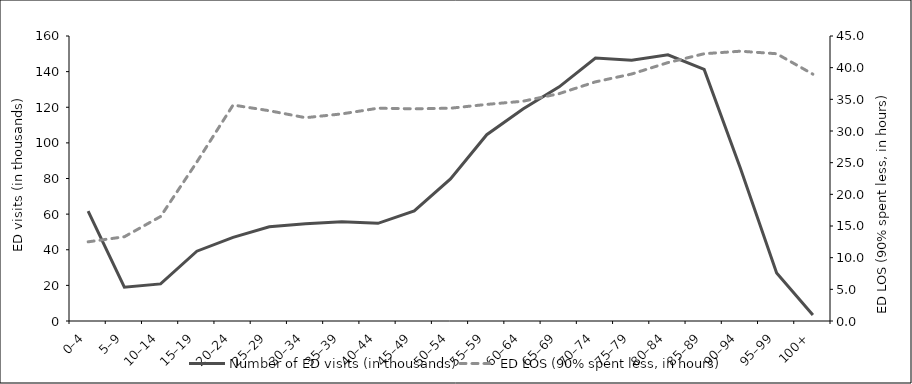
| Category | Number of ED visits (in thousands) |
|---|---|
| 0–4 | 61.654 |
| 5–9 | 18.978 |
| 10–14 | 20.829 |
| 15–19 | 39.176 |
| 20–24 | 46.913 |
| 25–29 | 52.938 |
| 30–34 | 54.609 |
| 35–39 | 55.651 |
| 40–44 | 54.828 |
| 45–49 | 61.77 |
| 50–54 | 79.72 |
| 55–59 | 104.573 |
| 60–64 | 119.043 |
| 65–69 | 131.439 |
| 70–74 | 147.645 |
| 75–79 | 146.341 |
| 80–84 | 149.408 |
| 85–89 | 141.251 |
| 90–94 | 85.809 |
| 95–99 | 26.976 |
| 100+ | 3.394 |